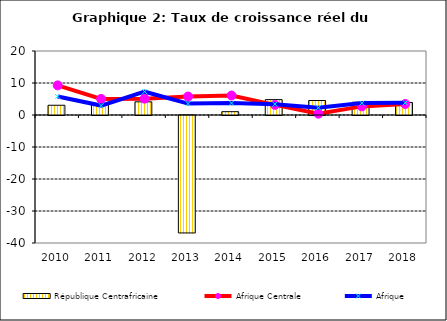
| Category | République Centrafricaine |
|---|---|
| 2010.0 | 3.047 |
| 2011.0 | 3.301 |
| 2012.0 | 4.113 |
| 2013.0 | -36.7 |
| 2014.0 | 1.04 |
| 2015.0 | 4.8 |
| 2016.0 | 4.531 |
| 2017.0 | 3.977 |
| 2018.0 | 3.93 |